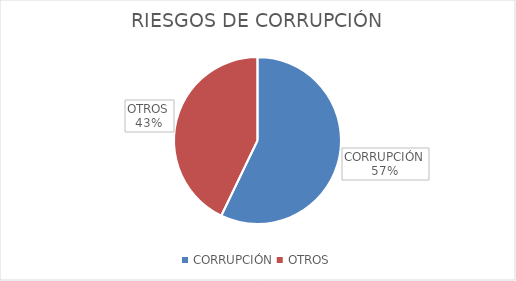
| Category | Series 0 |
|---|---|
| CORRUPCIÓN | 16 |
| OTROS | 12 |